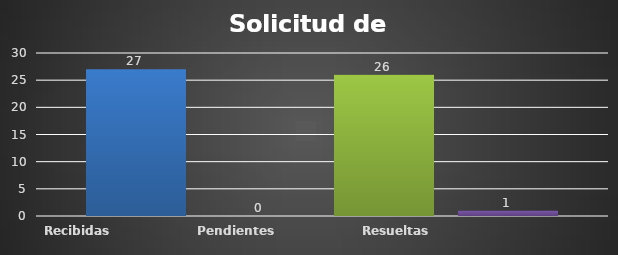
| Category | Recibidas  | Pendientes  | Resueltas | Rechazadas  |
|---|---|---|---|---|
| Recibidas  | 27 | 0 | 26 | 1 |